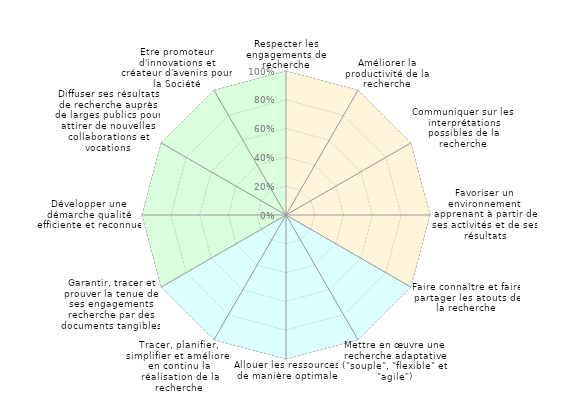
| Category | Efficacite | Efficience | Qualite | Formation |
|---|---|---|---|---|
| 0 | 1 | 0 | 1 | 0 |
| 1 | 1 | 0 | 0 | 0 |
| 2 | 1 | 0 | 0 | 0 |
| 3 | 1 | 0 | 0 | 0 |
| 4 | 1 | 1 | 0 | 0 |
| 5 | 0 | 1 | 0 | 0 |
| 6 | 0 | 1 | 0 | 0 |
| 7 | 0 | 1 | 0 | 0 |
| 8 | 0 | 1 | 1 | 0 |
| 9 | 0 | 0 | 1 | 0 |
| 10 | 0 | 0 | 1 | 0 |
| 11 | 0 | 0 | 1 | 0 |